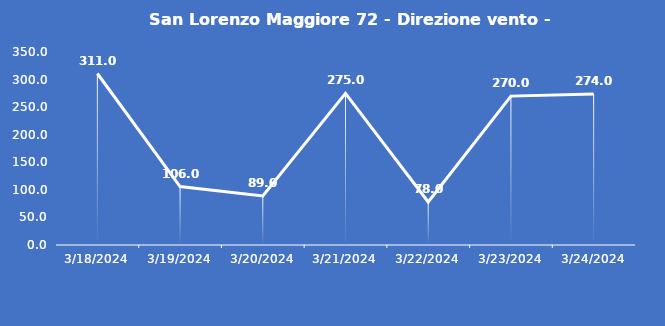
| Category | San Lorenzo Maggiore 72 - Direzione vento - Grezzo (°N) |
|---|---|
| 3/18/24 | 311 |
| 3/19/24 | 106 |
| 3/20/24 | 89 |
| 3/21/24 | 275 |
| 3/22/24 | 78 |
| 3/23/24 | 270 |
| 3/24/24 | 274 |